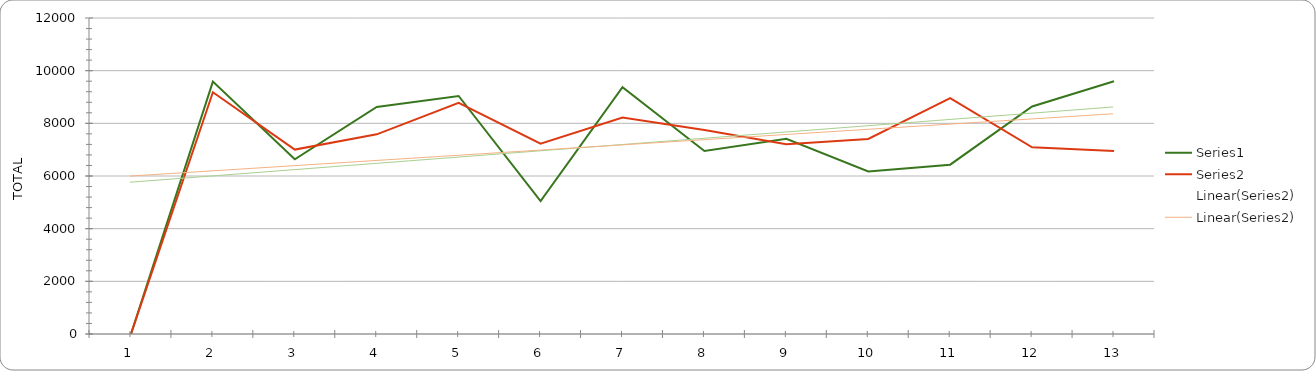
| Category | Series 0 | Series 1 |
|---|---|---|
| 0 | 0 | 0 |
| 1 | 9584 | 9181.133 |
| 2 | 6636 | 7003.683 |
| 3 | 8620 | 7581.733 |
| 4 | 9039 | 8778.733 |
| 5 | 5050 | 7226.733 |
| 6 | 9376 | 8216.733 |
| 7 | 6948 | 7745.633 |
| 8 | 7410 | 7202.963 |
| 9 | 6173 | 7406.733 |
| 10 | 6430 | 8960.733 |
| 11 | 8639 | 7087.963 |
| 12 | 9600 | 6947.533 |